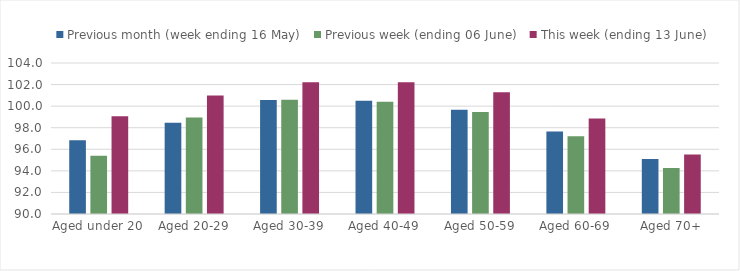
| Category | Previous month (week ending 16 May) | Previous week (ending 06 June) | This week (ending 13 June) |
|---|---|---|---|
| Aged under 20 | 96.83 | 95.399 | 99.063 |
| Aged 20-29 | 98.452 | 98.951 | 100.998 |
| Aged 30-39 | 100.56 | 100.594 | 102.206 |
| Aged 40-49 | 100.495 | 100.418 | 102.216 |
| Aged 50-59 | 99.66 | 99.448 | 101.293 |
| Aged 60-69 | 97.66 | 97.214 | 98.848 |
| Aged 70+ | 95.11 | 94.266 | 95.514 |